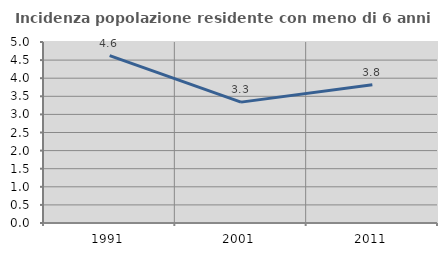
| Category | Incidenza popolazione residente con meno di 6 anni |
|---|---|
| 1991.0 | 4.625 |
| 2001.0 | 3.339 |
| 2011.0 | 3.819 |